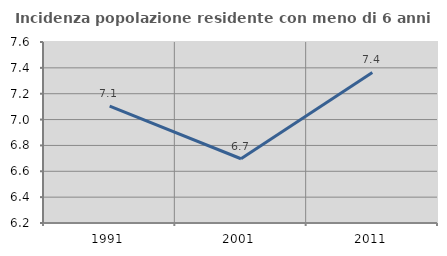
| Category | Incidenza popolazione residente con meno di 6 anni |
|---|---|
| 1991.0 | 7.103 |
| 2001.0 | 6.697 |
| 2011.0 | 7.365 |